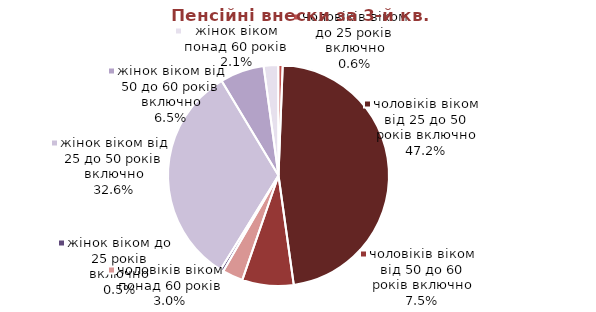
| Category | Series 0 |
|---|---|
| жінок віком до 25 років включно | 0.338 |
| жінок віком від 25 до 50 років включно | 24.18 |
| жінок віком від 50 до 60 років включно | 4.784 |
| жінок віком понад 60 років | 1.573 |
| чоловіків віком до 25 років включно | 0.481 |
| чоловіків віком від 25 до 50 років включно | 34.992 |
| чоловіків віком від 50 до 60 років включно | 5.574 |
| чоловіків віком понад 60 років | 2.245 |